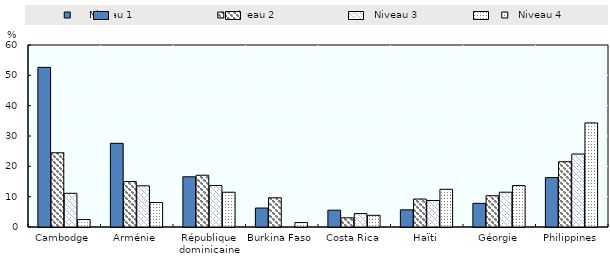
| Category |      Niveau 1 |  Niveau 2 |   Niveau 3 |   Niveau 4 |
|---|---|---|---|---|
| Cambodge | 52.632 | 24.474 | 11.111 | 2.454 |
| Arménie | 27.586 | 14.973 | 13.58 | 8.07 |
| République dominicaine | 16.556 | 17.075 | 13.684 | 11.458 |
| Burkina Faso | 6.25 | 9.628 | 0 | 1.456 |
| Costa Rica | 5.54 | 3.025 | 4.425 | 3.846 |
| Haïti | 5.66 | 9.216 | 8.738 | 12.432 |
| Géorgie | 7.801 | 10.315 | 11.475 | 13.657 |
| Philippines | 16.29 | 21.515 | 24.057 | 34.317 |